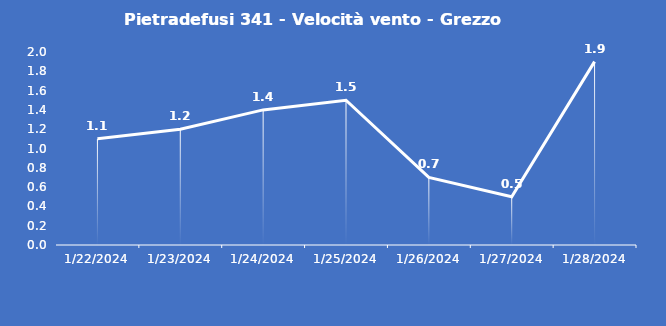
| Category | Pietradefusi 341 - Velocità vento - Grezzo (m/s) |
|---|---|
| 1/22/24 | 1.1 |
| 1/23/24 | 1.2 |
| 1/24/24 | 1.4 |
| 1/25/24 | 1.5 |
| 1/26/24 | 0.7 |
| 1/27/24 | 0.5 |
| 1/28/24 | 1.9 |